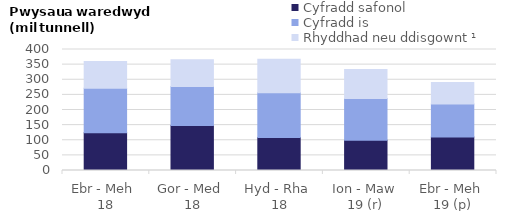
| Category | Cyfradd safonol | Cyfradd is | Rhyddhad neu ddisgownt ¹ |
|---|---|---|---|
| Ebr - Meh 
18 | 125 | 147 | 88 |
| Gor - Med 
18 | 149 | 129 | 88 |
| Hyd - Rha 
18 | 109 | 148 | 111 |
| Ion - Maw 
19 (r) | 100 | 138 | 96 |
| Ebr - Meh 
19 (p) | 111 | 109 | 71 |